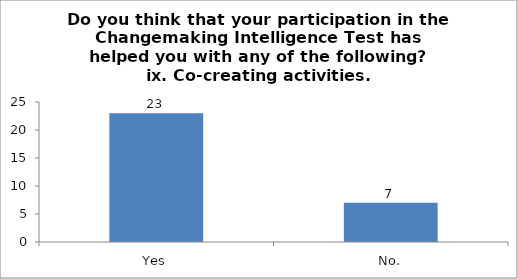
| Category | Do you think that your participation in the Changemaking Intelligence Test has helped you with any of the following?
ix. Co-creating activities. |
|---|---|
| Yes | 23 |
| No. | 7 |